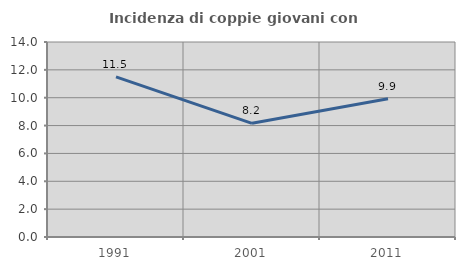
| Category | Incidenza di coppie giovani con figli |
|---|---|
| 1991.0 | 11.491 |
| 2001.0 | 8.163 |
| 2011.0 | 9.929 |